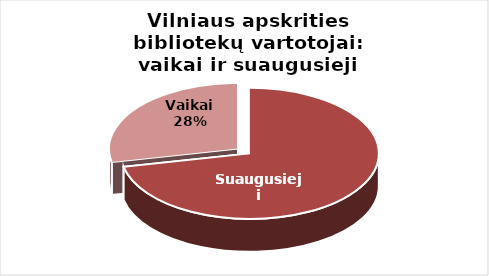
| Category | Series 0 |
|---|---|
| Suaugusieji | 79959 |
| Vaikai | 31559 |